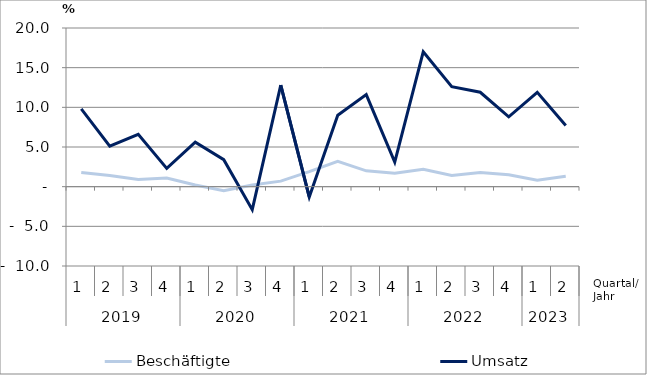
| Category | Beschäftigte | Umsatz |
|---|---|---|
| 0 | 1.8 | 9.8 |
| 1 | 1.4 | 5.1 |
| 2 | 0.9 | 6.6 |
| 3 | 1.1 | 2.3 |
| 4 | 0.2 | 5.6 |
| 5 | -0.5 | 3.4 |
| 6 | 0.2 | -2.9 |
| 7 | 0.7 | 12.8 |
| 8 | 1.9 | -1.3 |
| 9 | 3.2 | 9 |
| 10 | 2 | 11.6 |
| 11 | 1.7 | 3.1 |
| 12 | 2.2 | 17 |
| 13 | 1.4 | 12.6 |
| 14 | 1.8 | 11.9 |
| 15 | 1.5 | 8.8 |
| 16 | 0.8 | 11.9 |
| 17 | 1.3 | 7.7 |